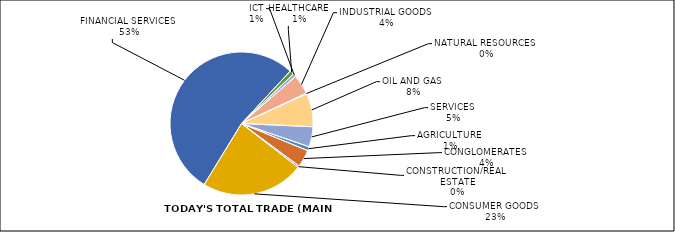
| Category | Series 0 |
|---|---|
| AGRICULTURE | 44 |
| CONGLOMERATES | 188 |
| CONSTRUCTION/REAL ESTATE | 19 |
| CONSUMER GOODS | 1114 |
| FINANCIAL SERVICES | 2551 |
| HEALTHCARE | 45 |
| ICT | 36 |
| INDUSTRIAL GOODS | 212 |
| NATURAL RESOURCES | 8 |
| OIL AND GAS | 361 |
| SERVICES | 218 |